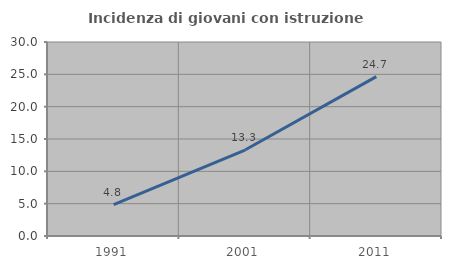
| Category | Incidenza di giovani con istruzione universitaria |
|---|---|
| 1991.0 | 4.85 |
| 2001.0 | 13.292 |
| 2011.0 | 24.654 |